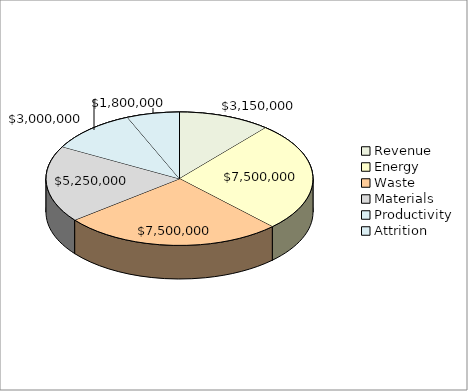
| Category | Series 0 |
|---|---|
| Revenue | 3150000 |
| Energy  | 7500000 |
| Waste  | 7500000 |
| Materials  | 5250000 |
| Productivity  | 3000000 |
| Attrition  | 1800000 |